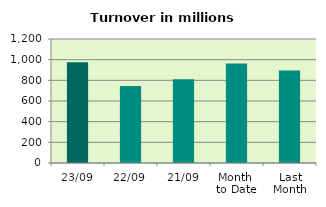
| Category | Series 0 |
|---|---|
| 23/09 | 973.989 |
| 22/09 | 744.038 |
| 21/09 | 810.419 |
| Month 
to Date | 962.707 |
| Last
Month | 893.956 |